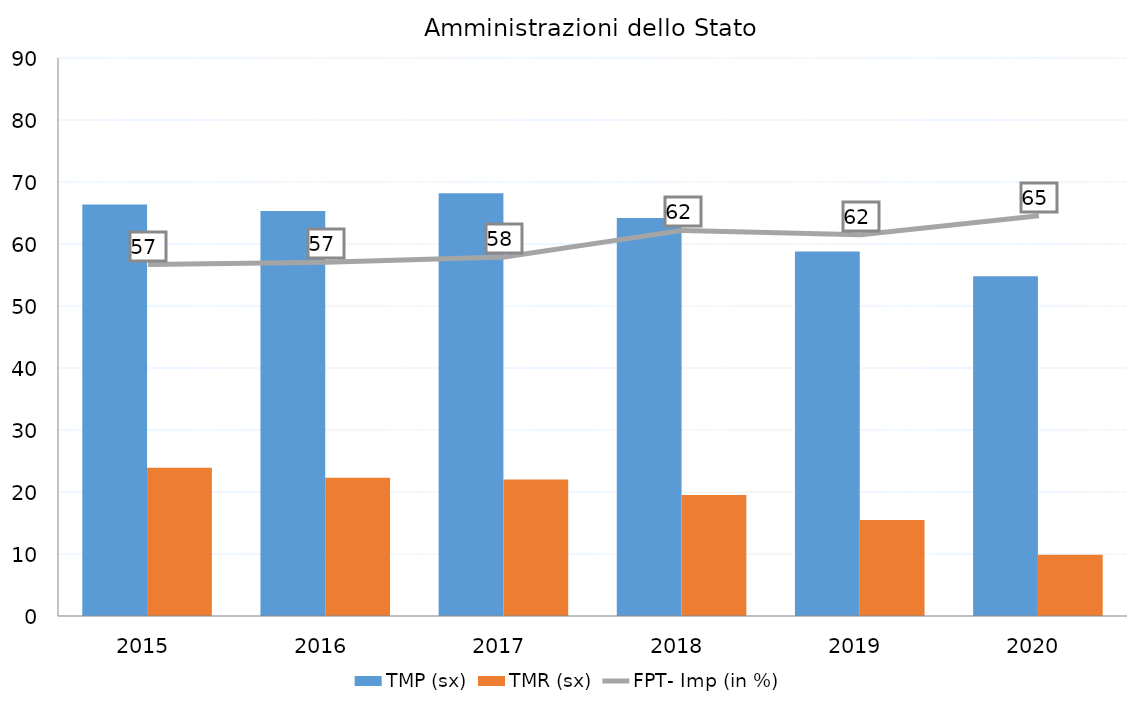
| Category | TMP (sx) | TMR (sx) |
|---|---|---|
| 2015.0 | 66.379 | 23.897 |
| 2016.0 | 65.306 | 22.281 |
| 2017.0 | 68.193 | 22.026 |
| 2018.0 | 64.176 | 19.53 |
| 2019.0 | 58.772 | 15.503 |
| 2020.0 | 54.817 | 9.891 |